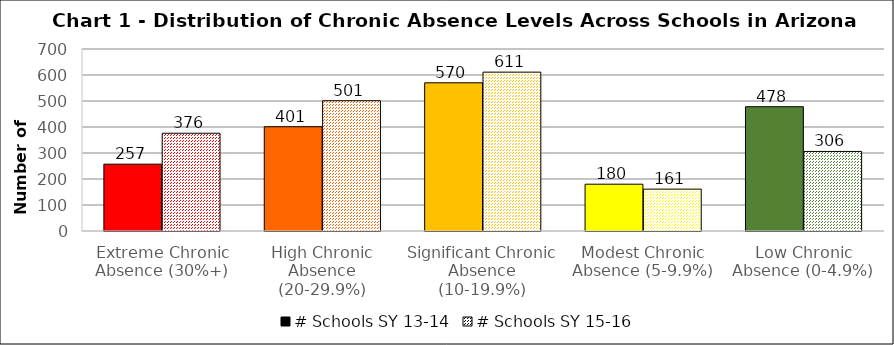
| Category | # Schools SY 13-14 | # Schools SY 15-16 |
|---|---|---|
| Extreme Chronic Absence (30%+) | 257 | 376 |
| High Chronic Absence (20-29.9%) | 401 | 501 |
| Significant Chronic Absence (10-19.9%) | 570 | 611 |
| Modest Chronic Absence (5-9.9%) | 180 | 161 |
| Low Chronic Absence (0-4.9%) | 478 | 306 |